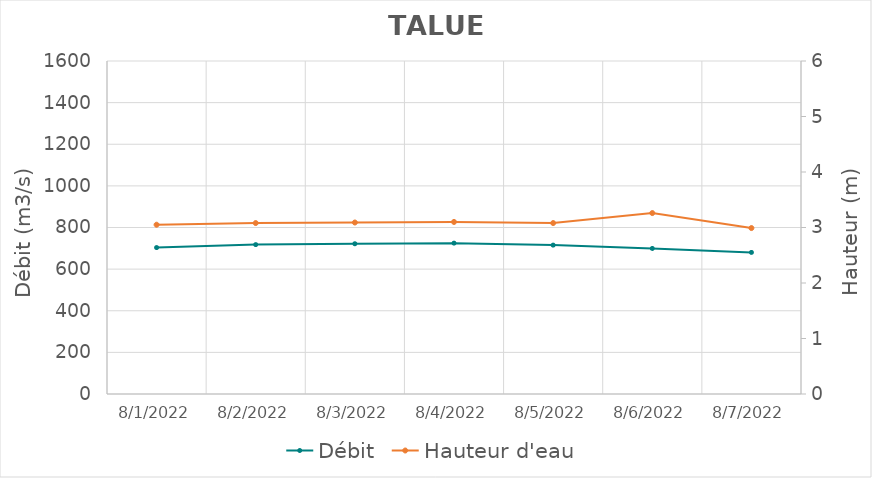
| Category | Débit |
|---|---|
| 6/29/22 | 970.33 |
| 6/28/22 | 870.37 |
| 6/27/22 | 866.57 |
| 6/26/22 | 901.38 |
| 6/25/22 | 936.19 |
| 6/24/22 | 950.44 |
| 6/23/22 | 962.21 |